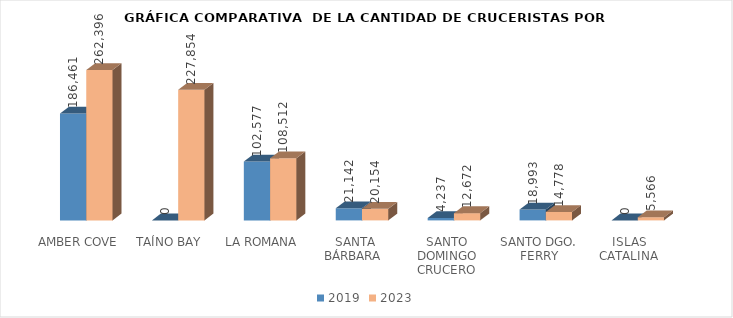
| Category | 2019 | 2023 |
|---|---|---|
| AMBER COVE | 186461 | 262396 |
| TAÍNO BAY | 0 | 227854 |
| LA ROMANA | 102577 | 108512 |
| SANTA BÁRBARA  | 21142 | 20154 |
| SANTO DOMINGO CRUCERO | 4237 | 12672 |
| SANTO DGO. FERRY | 18993 | 14778 |
| ISLAS  CATALINA  | 0 | 5566 |